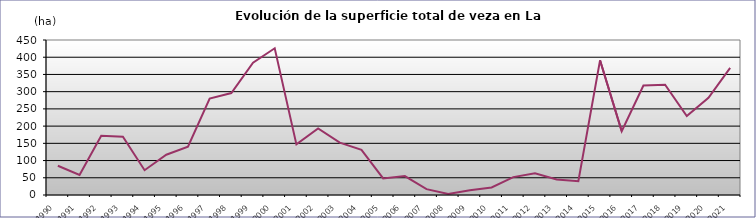
| Category | TOTAL |
|---|---|
| 1990.0 | 85 |
| 1991.0 | 58 |
| 1992.0 | 172 |
| 1993.0 | 169 |
| 1994.0 | 72 |
| 1995.0 | 117 |
| 1996.0 | 140 |
| 1997.0 | 280 |
| 1998.0 | 296 |
| 1999.0 | 384 |
| 2000.0 | 426 |
| 2001.0 | 147 |
| 2002.0 | 193 |
| 2003.0 | 152 |
| 2004.0 | 131 |
| 2005.0 | 48 |
| 2006.0 | 55 |
| 2007.0 | 17 |
| 2008.0 | 3 |
| 2009.0 | 14 |
| 2010.0 | 22 |
| 2011.0 | 52 |
| 2012.0 | 63 |
| 2013.0 | 45 |
| 2014.0 | 40 |
| 2015.0 | 391 |
| 2016.0 | 185 |
| 2017.0 | 318 |
| 2018.0 | 320 |
| 2019.0 | 229 |
| 2020.0 | 282 |
| 2021.0 | 369 |